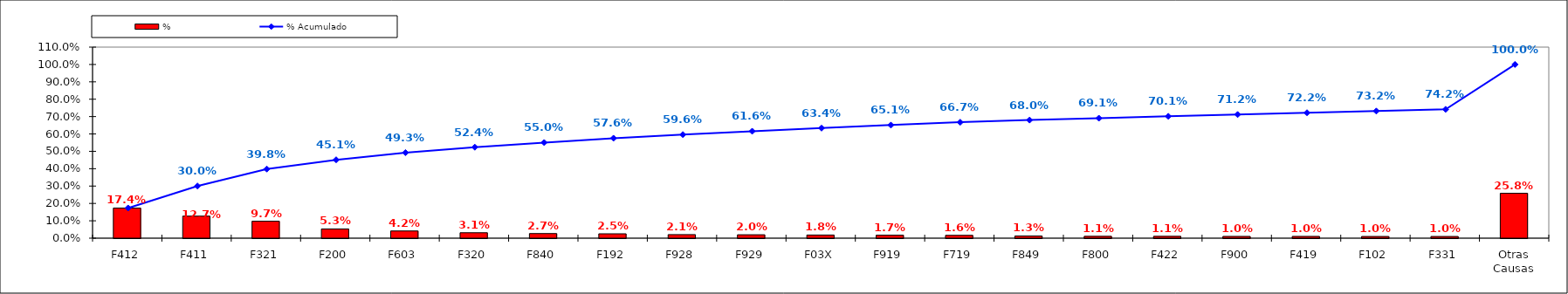
| Category | % |
|---|---|
| F412 | 0.174 |
| F411 | 0.127 |
| F321 | 0.097 |
| F200 | 0.053 |
| F603 | 0.042 |
| F320 | 0.031 |
| F840 | 0.027 |
| F192 | 0.025 |
| F928 | 0.021 |
| F929 | 0.02 |
| F03X | 0.018 |
| F919 | 0.017 |
| F719 | 0.016 |
| F849 | 0.013 |
| F800 | 0.011 |
| F422 | 0.011 |
| F900 | 0.01 |
| F419 | 0.01 |
| F102 | 0.01 |
| F331 | 0.01 |
| Otras Causas | 0.258 |